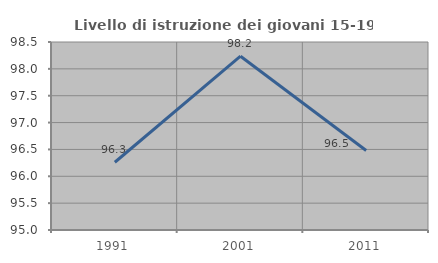
| Category | Livello di istruzione dei giovani 15-19 anni |
|---|---|
| 1991.0 | 96.262 |
| 2001.0 | 98.235 |
| 2011.0 | 96.479 |